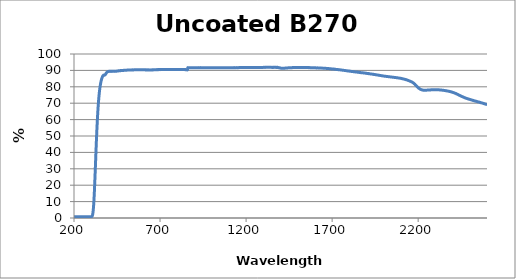
| Category | % Transmission |
|---|---|
| 2600.0 | 69.116 |
| 2599.0 | 69.14 |
| 2598.0 | 69.189 |
| 2597.0 | 69.218 |
| 2596.0 | 69.261 |
| 2595.0 | 69.309 |
| 2594.0 | 69.369 |
| 2593.0 | 69.388 |
| 2592.0 | 69.405 |
| 2591.0 | 69.42 |
| 2590.0 | 69.465 |
| 2589.0 | 69.522 |
| 2588.0 | 69.578 |
| 2587.0 | 69.609 |
| 2586.0 | 69.634 |
| 2585.0 | 69.664 |
| 2584.0 | 69.668 |
| 2583.0 | 69.731 |
| 2582.0 | 69.745 |
| 2581.0 | 69.807 |
| 2580.0 | 69.848 |
| 2579.0 | 69.88 |
| 2578.0 | 69.918 |
| 2577.0 | 69.944 |
| 2576.0 | 69.965 |
| 2575.0 | 69.997 |
| 2574.0 | 70.043 |
| 2573.0 | 70.062 |
| 2572.0 | 70.1 |
| 2571.0 | 70.118 |
| 2570.0 | 70.163 |
| 2569.0 | 70.201 |
| 2568.0 | 70.221 |
| 2567.0 | 70.244 |
| 2566.0 | 70.247 |
| 2565.0 | 70.27 |
| 2564.0 | 70.303 |
| 2563.0 | 70.335 |
| 2562.0 | 70.395 |
| 2561.0 | 70.423 |
| 2560.0 | 70.441 |
| 2559.0 | 70.482 |
| 2558.0 | 70.511 |
| 2557.0 | 70.542 |
| 2556.0 | 70.609 |
| 2555.0 | 70.639 |
| 2554.0 | 70.677 |
| 2553.0 | 70.68 |
| 2552.0 | 70.685 |
| 2551.0 | 70.708 |
| 2550.0 | 70.737 |
| 2549.0 | 70.765 |
| 2548.0 | 70.806 |
| 2547.0 | 70.851 |
| 2546.0 | 70.889 |
| 2545.0 | 70.893 |
| 2544.0 | 70.916 |
| 2543.0 | 70.946 |
| 2542.0 | 70.985 |
| 2541.0 | 71.043 |
| 2540.0 | 71.072 |
| 2539.0 | 71.084 |
| 2538.0 | 71.131 |
| 2537.0 | 71.17 |
| 2536.0 | 71.182 |
| 2535.0 | 71.202 |
| 2534.0 | 71.219 |
| 2533.0 | 71.249 |
| 2532.0 | 71.286 |
| 2531.0 | 71.333 |
| 2530.0 | 71.334 |
| 2529.0 | 71.368 |
| 2528.0 | 71.401 |
| 2527.0 | 71.455 |
| 2526.0 | 71.484 |
| 2525.0 | 71.505 |
| 2524.0 | 71.526 |
| 2523.0 | 71.565 |
| 2522.0 | 71.606 |
| 2521.0 | 71.629 |
| 2520.0 | 71.657 |
| 2519.0 | 71.678 |
| 2518.0 | 71.716 |
| 2517.0 | 71.77 |
| 2516.0 | 71.798 |
| 2515.0 | 71.824 |
| 2514.0 | 71.855 |
| 2513.0 | 71.877 |
| 2512.0 | 71.908 |
| 2511.0 | 71.929 |
| 2510.0 | 71.972 |
| 2509.0 | 72.004 |
| 2508.0 | 72.03 |
| 2507.0 | 72.074 |
| 2506.0 | 72.116 |
| 2505.0 | 72.154 |
| 2504.0 | 72.19 |
| 2503.0 | 72.197 |
| 2502.0 | 72.226 |
| 2501.0 | 72.265 |
| 2500.0 | 72.308 |
| 2499.0 | 72.335 |
| 2498.0 | 72.38 |
| 2497.0 | 72.411 |
| 2496.0 | 72.446 |
| 2495.0 | 72.469 |
| 2494.0 | 72.473 |
| 2493.0 | 72.484 |
| 2492.0 | 72.523 |
| 2491.0 | 72.568 |
| 2490.0 | 72.634 |
| 2489.0 | 72.668 |
| 2488.0 | 72.7 |
| 2487.0 | 72.739 |
| 2486.0 | 72.753 |
| 2485.0 | 72.778 |
| 2484.0 | 72.816 |
| 2483.0 | 72.873 |
| 2482.0 | 72.9 |
| 2481.0 | 72.934 |
| 2480.0 | 72.977 |
| 2479.0 | 73.023 |
| 2478.0 | 73.058 |
| 2477.0 | 73.094 |
| 2476.0 | 73.13 |
| 2475.0 | 73.161 |
| 2474.0 | 73.191 |
| 2473.0 | 73.233 |
| 2472.0 | 73.284 |
| 2471.0 | 73.334 |
| 2470.0 | 73.378 |
| 2469.0 | 73.427 |
| 2468.0 | 73.47 |
| 2467.0 | 73.521 |
| 2466.0 | 73.56 |
| 2465.0 | 73.612 |
| 2464.0 | 73.668 |
| 2463.0 | 73.713 |
| 2462.0 | 73.742 |
| 2461.0 | 73.78 |
| 2460.0 | 73.809 |
| 2459.0 | 73.857 |
| 2458.0 | 73.929 |
| 2457.0 | 73.994 |
| 2456.0 | 74.032 |
| 2455.0 | 74.065 |
| 2454.0 | 74.106 |
| 2453.0 | 74.15 |
| 2452.0 | 74.188 |
| 2451.0 | 74.227 |
| 2450.0 | 74.28 |
| 2449.0 | 74.339 |
| 2448.0 | 74.411 |
| 2447.0 | 74.457 |
| 2446.0 | 74.499 |
| 2445.0 | 74.547 |
| 2444.0 | 74.587 |
| 2443.0 | 74.638 |
| 2442.0 | 74.69 |
| 2441.0 | 74.74 |
| 2440.0 | 74.799 |
| 2439.0 | 74.855 |
| 2438.0 | 74.893 |
| 2437.0 | 74.929 |
| 2436.0 | 74.978 |
| 2435.0 | 75.032 |
| 2434.0 | 75.098 |
| 2433.0 | 75.175 |
| 2432.0 | 75.242 |
| 2431.0 | 75.296 |
| 2430.0 | 75.33 |
| 2429.0 | 75.372 |
| 2428.0 | 75.439 |
| 2427.0 | 75.493 |
| 2426.0 | 75.528 |
| 2425.0 | 75.576 |
| 2424.0 | 75.615 |
| 2423.0 | 75.653 |
| 2422.0 | 75.711 |
| 2421.0 | 75.786 |
| 2420.0 | 75.858 |
| 2419.0 | 75.903 |
| 2418.0 | 75.934 |
| 2417.0 | 75.967 |
| 2416.0 | 76.001 |
| 2415.0 | 76.044 |
| 2414.0 | 76.095 |
| 2413.0 | 76.128 |
| 2412.0 | 76.178 |
| 2411.0 | 76.23 |
| 2410.0 | 76.265 |
| 2409.0 | 76.302 |
| 2408.0 | 76.327 |
| 2407.0 | 76.374 |
| 2406.0 | 76.417 |
| 2405.0 | 76.459 |
| 2404.0 | 76.512 |
| 2403.0 | 76.544 |
| 2402.0 | 76.567 |
| 2401.0 | 76.594 |
| 2400.0 | 76.624 |
| 2399.0 | 76.653 |
| 2398.0 | 76.697 |
| 2397.0 | 76.749 |
| 2396.0 | 76.783 |
| 2395.0 | 76.81 |
| 2394.0 | 76.838 |
| 2393.0 | 76.872 |
| 2392.0 | 76.909 |
| 2391.0 | 76.939 |
| 2390.0 | 76.959 |
| 2389.0 | 76.97 |
| 2388.0 | 77.01 |
| 2387.0 | 77.062 |
| 2386.0 | 77.091 |
| 2385.0 | 77.105 |
| 2384.0 | 77.116 |
| 2383.0 | 77.134 |
| 2382.0 | 77.155 |
| 2381.0 | 77.186 |
| 2380.0 | 77.245 |
| 2379.0 | 77.28 |
| 2378.0 | 77.286 |
| 2377.0 | 77.291 |
| 2376.0 | 77.315 |
| 2375.0 | 77.342 |
| 2374.0 | 77.364 |
| 2373.0 | 77.37 |
| 2372.0 | 77.402 |
| 2371.0 | 77.437 |
| 2370.0 | 77.464 |
| 2369.0 | 77.493 |
| 2368.0 | 77.502 |
| 2367.0 | 77.499 |
| 2366.0 | 77.508 |
| 2365.0 | 77.536 |
| 2364.0 | 77.55 |
| 2363.0 | 77.583 |
| 2362.0 | 77.605 |
| 2361.0 | 77.632 |
| 2360.0 | 77.656 |
| 2359.0 | 77.66 |
| 2358.0 | 77.672 |
| 2357.0 | 77.686 |
| 2356.0 | 77.7 |
| 2355.0 | 77.727 |
| 2354.0 | 77.747 |
| 2353.0 | 77.765 |
| 2352.0 | 77.776 |
| 2351.0 | 77.789 |
| 2350.0 | 77.802 |
| 2349.0 | 77.83 |
| 2348.0 | 77.836 |
| 2347.0 | 77.866 |
| 2346.0 | 77.904 |
| 2345.0 | 77.89 |
| 2344.0 | 77.894 |
| 2343.0 | 77.918 |
| 2342.0 | 77.923 |
| 2341.0 | 77.918 |
| 2340.0 | 77.918 |
| 2339.0 | 77.952 |
| 2338.0 | 77.975 |
| 2337.0 | 77.997 |
| 2336.0 | 78.012 |
| 2335.0 | 78.021 |
| 2334.0 | 78.003 |
| 2333.0 | 77.996 |
| 2332.0 | 78.009 |
| 2331.0 | 78.046 |
| 2330.0 | 78.067 |
| 2329.0 | 78.088 |
| 2328.0 | 78.09 |
| 2327.0 | 78.086 |
| 2326.0 | 78.101 |
| 2325.0 | 78.101 |
| 2324.0 | 78.105 |
| 2323.0 | 78.137 |
| 2322.0 | 78.146 |
| 2321.0 | 78.142 |
| 2320.0 | 78.137 |
| 2319.0 | 78.159 |
| 2318.0 | 78.162 |
| 2317.0 | 78.161 |
| 2316.0 | 78.149 |
| 2315.0 | 78.155 |
| 2314.0 | 78.177 |
| 2313.0 | 78.183 |
| 2312.0 | 78.177 |
| 2311.0 | 78.176 |
| 2310.0 | 78.196 |
| 2309.0 | 78.202 |
| 2308.0 | 78.208 |
| 2307.0 | 78.21 |
| 2306.0 | 78.218 |
| 2305.0 | 78.232 |
| 2304.0 | 78.245 |
| 2303.0 | 78.227 |
| 2302.0 | 78.213 |
| 2301.0 | 78.204 |
| 2300.0 | 78.212 |
| 2299.0 | 78.199 |
| 2298.0 | 78.232 |
| 2297.0 | 78.244 |
| 2296.0 | 78.231 |
| 2295.0 | 78.217 |
| 2294.0 | 78.215 |
| 2293.0 | 78.204 |
| 2292.0 | 78.215 |
| 2291.0 | 78.211 |
| 2290.0 | 78.19 |
| 2289.0 | 78.212 |
| 2288.0 | 78.212 |
| 2287.0 | 78.207 |
| 2286.0 | 78.208 |
| 2285.0 | 78.185 |
| 2284.0 | 78.181 |
| 2283.0 | 78.16 |
| 2282.0 | 78.151 |
| 2281.0 | 78.167 |
| 2280.0 | 78.173 |
| 2279.0 | 78.193 |
| 2278.0 | 78.178 |
| 2277.0 | 78.162 |
| 2276.0 | 78.167 |
| 2275.0 | 78.141 |
| 2274.0 | 78.142 |
| 2273.0 | 78.107 |
| 2272.0 | 78.097 |
| 2271.0 | 78.105 |
| 2270.0 | 78.106 |
| 2269.0 | 78.095 |
| 2268.0 | 78.098 |
| 2267.0 | 78.099 |
| 2266.0 | 78.104 |
| 2265.0 | 78.106 |
| 2264.0 | 78.078 |
| 2263.0 | 78.061 |
| 2262.0 | 78.048 |
| 2261.0 | 78.049 |
| 2260.0 | 78.011 |
| 2259.0 | 78.012 |
| 2258.0 | 78.003 |
| 2257.0 | 77.992 |
| 2256.0 | 78.001 |
| 2255.0 | 78.012 |
| 2254.0 | 78.011 |
| 2253.0 | 77.994 |
| 2252.0 | 77.976 |
| 2251.0 | 77.968 |
| 2250.0 | 77.962 |
| 2249.0 | 77.961 |
| 2248.0 | 77.947 |
| 2247.0 | 77.94 |
| 2246.0 | 77.906 |
| 2245.0 | 77.922 |
| 2244.0 | 77.925 |
| 2243.0 | 77.943 |
| 2242.0 | 77.917 |
| 2241.0 | 77.925 |
| 2240.0 | 77.903 |
| 2239.0 | 77.89 |
| 2238.0 | 77.908 |
| 2237.0 | 77.898 |
| 2236.0 | 77.923 |
| 2235.0 | 77.922 |
| 2234.0 | 77.909 |
| 2233.0 | 77.899 |
| 2232.0 | 77.922 |
| 2231.0 | 77.915 |
| 2230.0 | 77.924 |
| 2229.0 | 77.952 |
| 2228.0 | 77.975 |
| 2227.0 | 78.02 |
| 2226.0 | 78.027 |
| 2225.0 | 78.048 |
| 2224.0 | 78.073 |
| 2223.0 | 78.098 |
| 2222.0 | 78.118 |
| 2221.0 | 78.158 |
| 2220.0 | 78.208 |
| 2219.0 | 78.22 |
| 2218.0 | 78.25 |
| 2217.0 | 78.309 |
| 2216.0 | 78.352 |
| 2215.0 | 78.404 |
| 2214.0 | 78.436 |
| 2213.0 | 78.489 |
| 2212.0 | 78.561 |
| 2211.0 | 78.646 |
| 2210.0 | 78.7 |
| 2209.0 | 78.764 |
| 2208.0 | 78.832 |
| 2207.0 | 78.907 |
| 2206.0 | 78.969 |
| 2205.0 | 79.05 |
| 2204.0 | 79.131 |
| 2203.0 | 79.197 |
| 2202.0 | 79.283 |
| 2201.0 | 79.341 |
| 2200.0 | 79.433 |
| 2199.0 | 79.549 |
| 2198.0 | 79.707 |
| 2197.0 | 79.754 |
| 2196.0 | 79.857 |
| 2195.0 | 79.95 |
| 2194.0 | 80.057 |
| 2193.0 | 80.179 |
| 2192.0 | 80.303 |
| 2191.0 | 80.417 |
| 2190.0 | 80.52 |
| 2189.0 | 80.635 |
| 2188.0 | 80.73 |
| 2187.0 | 80.857 |
| 2186.0 | 80.992 |
| 2185.0 | 81.098 |
| 2184.0 | 81.221 |
| 2183.0 | 81.294 |
| 2182.0 | 81.434 |
| 2181.0 | 81.545 |
| 2180.0 | 81.646 |
| 2179.0 | 81.726 |
| 2178.0 | 81.839 |
| 2177.0 | 81.936 |
| 2176.0 | 82.029 |
| 2175.0 | 82.106 |
| 2174.0 | 82.194 |
| 2173.0 | 82.277 |
| 2172.0 | 82.359 |
| 2171.0 | 82.426 |
| 2170.0 | 82.51 |
| 2169.0 | 82.563 |
| 2168.0 | 82.636 |
| 2167.0 | 82.71 |
| 2166.0 | 82.774 |
| 2165.0 | 82.826 |
| 2164.0 | 82.894 |
| 2163.0 | 82.962 |
| 2162.0 | 82.995 |
| 2161.0 | 83.045 |
| 2160.0 | 83.117 |
| 2159.0 | 83.165 |
| 2158.0 | 83.188 |
| 2157.0 | 83.228 |
| 2156.0 | 83.28 |
| 2155.0 | 83.315 |
| 2154.0 | 83.387 |
| 2153.0 | 83.441 |
| 2152.0 | 83.497 |
| 2151.0 | 83.539 |
| 2150.0 | 83.567 |
| 2149.0 | 83.618 |
| 2148.0 | 83.645 |
| 2147.0 | 83.671 |
| 2146.0 | 83.735 |
| 2145.0 | 83.775 |
| 2144.0 | 83.808 |
| 2143.0 | 83.822 |
| 2142.0 | 83.859 |
| 2141.0 | 83.907 |
| 2140.0 | 83.956 |
| 2139.0 | 84.006 |
| 2138.0 | 84.035 |
| 2137.0 | 84.096 |
| 2136.0 | 84.136 |
| 2135.0 | 84.169 |
| 2134.0 | 84.184 |
| 2133.0 | 84.216 |
| 2132.0 | 84.262 |
| 2131.0 | 84.283 |
| 2130.0 | 84.314 |
| 2129.0 | 84.358 |
| 2128.0 | 84.4 |
| 2127.0 | 84.443 |
| 2126.0 | 84.458 |
| 2125.0 | 84.475 |
| 2124.0 | 84.488 |
| 2123.0 | 84.534 |
| 2122.0 | 84.574 |
| 2121.0 | 84.604 |
| 2120.0 | 84.621 |
| 2119.0 | 84.664 |
| 2118.0 | 84.671 |
| 2117.0 | 84.703 |
| 2116.0 | 84.723 |
| 2115.0 | 84.739 |
| 2114.0 | 84.789 |
| 2113.0 | 84.804 |
| 2112.0 | 84.83 |
| 2111.0 | 84.854 |
| 2110.0 | 84.89 |
| 2109.0 | 84.929 |
| 2108.0 | 84.936 |
| 2107.0 | 84.948 |
| 2106.0 | 84.956 |
| 2105.0 | 84.987 |
| 2104.0 | 85.037 |
| 2103.0 | 85.047 |
| 2102.0 | 85.078 |
| 2101.0 | 85.103 |
| 2100.0 | 85.136 |
| 2099.0 | 85.168 |
| 2098.0 | 85.173 |
| 2097.0 | 85.191 |
| 2096.0 | 85.217 |
| 2095.0 | 85.235 |
| 2094.0 | 85.264 |
| 2093.0 | 85.271 |
| 2092.0 | 85.287 |
| 2091.0 | 85.295 |
| 2090.0 | 85.311 |
| 2089.0 | 85.327 |
| 2088.0 | 85.347 |
| 2087.0 | 85.365 |
| 2086.0 | 85.36 |
| 2085.0 | 85.362 |
| 2084.0 | 85.4 |
| 2083.0 | 85.427 |
| 2082.0 | 85.443 |
| 2081.0 | 85.453 |
| 2080.0 | 85.474 |
| 2079.0 | 85.507 |
| 2078.0 | 85.523 |
| 2077.0 | 85.522 |
| 2076.0 | 85.52 |
| 2075.0 | 85.531 |
| 2074.0 | 85.549 |
| 2073.0 | 85.574 |
| 2072.0 | 85.591 |
| 2071.0 | 85.62 |
| 2070.0 | 85.656 |
| 2069.0 | 85.67 |
| 2068.0 | 85.65 |
| 2067.0 | 85.649 |
| 2066.0 | 85.652 |
| 2065.0 | 85.67 |
| 2064.0 | 85.692 |
| 2063.0 | 85.711 |
| 2062.0 | 85.731 |
| 2061.0 | 85.739 |
| 2060.0 | 85.755 |
| 2059.0 | 85.787 |
| 2058.0 | 85.801 |
| 2057.0 | 85.803 |
| 2056.0 | 85.808 |
| 2055.0 | 85.819 |
| 2054.0 | 85.813 |
| 2053.0 | 85.815 |
| 2052.0 | 85.817 |
| 2051.0 | 85.835 |
| 2050.0 | 85.868 |
| 2049.0 | 85.888 |
| 2048.0 | 85.903 |
| 2047.0 | 85.913 |
| 2046.0 | 85.92 |
| 2045.0 | 85.94 |
| 2044.0 | 85.962 |
| 2043.0 | 85.962 |
| 2042.0 | 85.976 |
| 2041.0 | 86.001 |
| 2040.0 | 86.01 |
| 2039.0 | 86.023 |
| 2038.0 | 86.03 |
| 2037.0 | 86.044 |
| 2036.0 | 86.059 |
| 2035.0 | 86.07 |
| 2034.0 | 86.082 |
| 2033.0 | 86.101 |
| 2032.0 | 86.135 |
| 2031.0 | 86.164 |
| 2030.0 | 86.174 |
| 2029.0 | 86.162 |
| 2028.0 | 86.178 |
| 2027.0 | 86.192 |
| 2026.0 | 86.188 |
| 2025.0 | 86.216 |
| 2024.0 | 86.233 |
| 2023.0 | 86.238 |
| 2022.0 | 86.259 |
| 2021.0 | 86.253 |
| 2020.0 | 86.255 |
| 2019.0 | 86.28 |
| 2018.0 | 86.293 |
| 2017.0 | 86.315 |
| 2016.0 | 86.334 |
| 2015.0 | 86.348 |
| 2014.0 | 86.354 |
| 2013.0 | 86.353 |
| 2012.0 | 86.375 |
| 2011.0 | 86.405 |
| 2010.0 | 86.419 |
| 2009.0 | 86.434 |
| 2008.0 | 86.447 |
| 2007.0 | 86.46 |
| 2006.0 | 86.47 |
| 2005.0 | 86.478 |
| 2004.0 | 86.475 |
| 2003.0 | 86.499 |
| 2002.0 | 86.517 |
| 2001.0 | 86.531 |
| 2000.0 | 86.557 |
| 1999.0 | 86.579 |
| 1998.0 | 86.592 |
| 1997.0 | 86.6 |
| 1996.0 | 86.616 |
| 1995.0 | 86.631 |
| 1994.0 | 86.656 |
| 1993.0 | 86.66 |
| 1992.0 | 86.675 |
| 1991.0 | 86.712 |
| 1990.0 | 86.727 |
| 1989.0 | 86.721 |
| 1988.0 | 86.75 |
| 1987.0 | 86.773 |
| 1986.0 | 86.795 |
| 1985.0 | 86.81 |
| 1984.0 | 86.827 |
| 1983.0 | 86.831 |
| 1982.0 | 86.846 |
| 1981.0 | 86.865 |
| 1980.0 | 86.881 |
| 1979.0 | 86.906 |
| 1978.0 | 86.928 |
| 1977.0 | 86.946 |
| 1976.0 | 86.958 |
| 1975.0 | 86.976 |
| 1974.0 | 86.994 |
| 1973.0 | 87.022 |
| 1972.0 | 87.032 |
| 1971.0 | 87.054 |
| 1970.0 | 87.074 |
| 1969.0 | 87.091 |
| 1968.0 | 87.127 |
| 1967.0 | 87.143 |
| 1966.0 | 87.142 |
| 1965.0 | 87.162 |
| 1964.0 | 87.19 |
| 1963.0 | 87.201 |
| 1962.0 | 87.233 |
| 1961.0 | 87.253 |
| 1960.0 | 87.238 |
| 1959.0 | 87.264 |
| 1958.0 | 87.283 |
| 1957.0 | 87.284 |
| 1956.0 | 87.328 |
| 1955.0 | 87.343 |
| 1954.0 | 87.379 |
| 1953.0 | 87.402 |
| 1952.0 | 87.39 |
| 1951.0 | 87.398 |
| 1950.0 | 87.439 |
| 1949.0 | 87.449 |
| 1948.0 | 87.443 |
| 1947.0 | 87.474 |
| 1946.0 | 87.487 |
| 1945.0 | 87.487 |
| 1944.0 | 87.546 |
| 1943.0 | 87.545 |
| 1942.0 | 87.511 |
| 1941.0 | 87.6 |
| 1940.0 | 87.611 |
| 1939.0 | 87.654 |
| 1938.0 | 87.654 |
| 1937.0 | 87.665 |
| 1936.0 | 87.681 |
| 1935.0 | 87.677 |
| 1934.0 | 87.679 |
| 1933.0 | 87.704 |
| 1932.0 | 87.752 |
| 1931.0 | 87.764 |
| 1930.0 | 87.766 |
| 1929.0 | 87.76 |
| 1928.0 | 87.76 |
| 1927.0 | 87.788 |
| 1926.0 | 87.795 |
| 1925.0 | 87.812 |
| 1924.0 | 87.825 |
| 1923.0 | 87.858 |
| 1922.0 | 87.871 |
| 1921.0 | 87.874 |
| 1920.0 | 87.878 |
| 1919.0 | 87.904 |
| 1918.0 | 87.899 |
| 1917.0 | 87.953 |
| 1916.0 | 87.99 |
| 1915.0 | 88.037 |
| 1914.0 | 88.038 |
| 1913.0 | 88.028 |
| 1912.0 | 88.014 |
| 1911.0 | 88.048 |
| 1910.0 | 88.043 |
| 1909.0 | 88.078 |
| 1908.0 | 88.14 |
| 1907.0 | 88.151 |
| 1906.0 | 88.181 |
| 1905.0 | 88.174 |
| 1904.0 | 88.152 |
| 1903.0 | 88.145 |
| 1902.0 | 88.162 |
| 1901.0 | 88.215 |
| 1900.0 | 88.179 |
| 1899.0 | 88.226 |
| 1898.0 | 88.282 |
| 1897.0 | 88.248 |
| 1896.0 | 88.295 |
| 1895.0 | 88.246 |
| 1894.0 | 88.327 |
| 1893.0 | 88.353 |
| 1892.0 | 88.374 |
| 1891.0 | 88.333 |
| 1890.0 | 88.354 |
| 1889.0 | 88.357 |
| 1888.0 | 88.373 |
| 1887.0 | 88.437 |
| 1886.0 | 88.421 |
| 1885.0 | 88.426 |
| 1884.0 | 88.453 |
| 1883.0 | 88.445 |
| 1882.0 | 88.494 |
| 1881.0 | 88.466 |
| 1880.0 | 88.529 |
| 1879.0 | 88.491 |
| 1878.0 | 88.533 |
| 1877.0 | 88.544 |
| 1876.0 | 88.582 |
| 1875.0 | 88.592 |
| 1874.0 | 88.606 |
| 1873.0 | 88.596 |
| 1872.0 | 88.579 |
| 1871.0 | 88.592 |
| 1870.0 | 88.602 |
| 1869.0 | 88.589 |
| 1868.0 | 88.603 |
| 1867.0 | 88.631 |
| 1866.0 | 88.643 |
| 1865.0 | 88.645 |
| 1864.0 | 88.701 |
| 1863.0 | 88.745 |
| 1862.0 | 88.756 |
| 1861.0 | 88.759 |
| 1860.0 | 88.742 |
| 1859.0 | 88.738 |
| 1858.0 | 88.796 |
| 1857.0 | 88.796 |
| 1856.0 | 88.787 |
| 1855.0 | 88.807 |
| 1854.0 | 88.833 |
| 1853.0 | 88.853 |
| 1852.0 | 88.845 |
| 1851.0 | 88.825 |
| 1850.0 | 88.894 |
| 1849.0 | 88.933 |
| 1848.0 | 89.016 |
| 1847.0 | 88.977 |
| 1846.0 | 88.914 |
| 1845.0 | 88.995 |
| 1844.0 | 88.957 |
| 1843.0 | 88.944 |
| 1842.0 | 88.978 |
| 1841.0 | 89.013 |
| 1840.0 | 88.976 |
| 1839.0 | 89.03 |
| 1838.0 | 88.986 |
| 1837.0 | 89.049 |
| 1836.0 | 89.05 |
| 1835.0 | 89.077 |
| 1834.0 | 89.031 |
| 1833.0 | 89.073 |
| 1832.0 | 89.121 |
| 1831.0 | 89.125 |
| 1830.0 | 89.13 |
| 1829.0 | 89.2 |
| 1828.0 | 89.179 |
| 1827.0 | 89.171 |
| 1826.0 | 89.198 |
| 1825.0 | 89.199 |
| 1824.0 | 89.217 |
| 1823.0 | 89.257 |
| 1822.0 | 89.266 |
| 1821.0 | 89.286 |
| 1820.0 | 89.272 |
| 1819.0 | 89.288 |
| 1818.0 | 89.283 |
| 1817.0 | 89.3 |
| 1816.0 | 89.347 |
| 1815.0 | 89.357 |
| 1814.0 | 89.378 |
| 1813.0 | 89.388 |
| 1812.0 | 89.387 |
| 1811.0 | 89.387 |
| 1810.0 | 89.404 |
| 1809.0 | 89.417 |
| 1808.0 | 89.467 |
| 1807.0 | 89.472 |
| 1806.0 | 89.486 |
| 1805.0 | 89.502 |
| 1804.0 | 89.523 |
| 1803.0 | 89.524 |
| 1802.0 | 89.541 |
| 1801.0 | 89.55 |
| 1800.0 | 89.58 |
| 1799.0 | 89.594 |
| 1798.0 | 89.599 |
| 1797.0 | 89.609 |
| 1796.0 | 89.646 |
| 1795.0 | 89.619 |
| 1794.0 | 89.635 |
| 1793.0 | 89.653 |
| 1792.0 | 89.668 |
| 1791.0 | 89.685 |
| 1790.0 | 89.694 |
| 1789.0 | 89.708 |
| 1788.0 | 89.726 |
| 1787.0 | 89.754 |
| 1786.0 | 89.774 |
| 1785.0 | 89.792 |
| 1784.0 | 89.785 |
| 1783.0 | 89.811 |
| 1782.0 | 89.82 |
| 1781.0 | 89.822 |
| 1780.0 | 89.858 |
| 1779.0 | 89.862 |
| 1778.0 | 89.873 |
| 1777.0 | 89.894 |
| 1776.0 | 89.893 |
| 1775.0 | 89.916 |
| 1774.0 | 89.92 |
| 1773.0 | 89.951 |
| 1772.0 | 89.959 |
| 1771.0 | 89.97 |
| 1770.0 | 89.997 |
| 1769.0 | 90.011 |
| 1768.0 | 90.027 |
| 1767.0 | 90.041 |
| 1766.0 | 90.068 |
| 1765.0 | 90.081 |
| 1764.0 | 90.087 |
| 1763.0 | 90.1 |
| 1762.0 | 90.11 |
| 1761.0 | 90.133 |
| 1760.0 | 90.129 |
| 1759.0 | 90.148 |
| 1758.0 | 90.169 |
| 1757.0 | 90.185 |
| 1756.0 | 90.191 |
| 1755.0 | 90.218 |
| 1754.0 | 90.241 |
| 1753.0 | 90.233 |
| 1752.0 | 90.245 |
| 1751.0 | 90.269 |
| 1750.0 | 90.307 |
| 1749.0 | 90.304 |
| 1748.0 | 90.312 |
| 1747.0 | 90.334 |
| 1746.0 | 90.35 |
| 1745.0 | 90.366 |
| 1744.0 | 90.371 |
| 1743.0 | 90.39 |
| 1742.0 | 90.388 |
| 1741.0 | 90.395 |
| 1740.0 | 90.404 |
| 1739.0 | 90.408 |
| 1738.0 | 90.418 |
| 1737.0 | 90.426 |
| 1736.0 | 90.44 |
| 1735.0 | 90.444 |
| 1734.0 | 90.511 |
| 1733.0 | 90.509 |
| 1732.0 | 90.523 |
| 1731.0 | 90.519 |
| 1730.0 | 90.537 |
| 1729.0 | 90.546 |
| 1728.0 | 90.557 |
| 1727.0 | 90.575 |
| 1726.0 | 90.595 |
| 1725.0 | 90.596 |
| 1724.0 | 90.607 |
| 1723.0 | 90.618 |
| 1722.0 | 90.619 |
| 1721.0 | 90.641 |
| 1720.0 | 90.659 |
| 1719.0 | 90.685 |
| 1718.0 | 90.688 |
| 1717.0 | 90.692 |
| 1716.0 | 90.713 |
| 1715.0 | 90.722 |
| 1714.0 | 90.746 |
| 1713.0 | 90.777 |
| 1712.0 | 90.777 |
| 1711.0 | 90.765 |
| 1710.0 | 90.789 |
| 1709.0 | 90.82 |
| 1708.0 | 90.818 |
| 1707.0 | 90.831 |
| 1706.0 | 90.842 |
| 1705.0 | 90.865 |
| 1704.0 | 90.875 |
| 1703.0 | 90.877 |
| 1702.0 | 90.883 |
| 1701.0 | 90.884 |
| 1700.0 | 90.883 |
| 1699.0 | 90.875 |
| 1698.0 | 90.88 |
| 1697.0 | 90.906 |
| 1696.0 | 90.93 |
| 1695.0 | 90.928 |
| 1694.0 | 90.923 |
| 1693.0 | 90.952 |
| 1692.0 | 90.982 |
| 1691.0 | 90.985 |
| 1690.0 | 91 |
| 1689.0 | 91.015 |
| 1688.0 | 91.024 |
| 1687.0 | 91.034 |
| 1686.0 | 91.05 |
| 1685.0 | 91.056 |
| 1684.0 | 91.058 |
| 1683.0 | 91.064 |
| 1682.0 | 91.083 |
| 1681.0 | 91.103 |
| 1680.0 | 91.097 |
| 1679.0 | 91.093 |
| 1678.0 | 91.122 |
| 1677.0 | 91.129 |
| 1676.0 | 91.13 |
| 1675.0 | 91.152 |
| 1674.0 | 91.155 |
| 1673.0 | 91.143 |
| 1672.0 | 91.185 |
| 1671.0 | 91.209 |
| 1670.0 | 91.209 |
| 1669.0 | 91.218 |
| 1668.0 | 91.219 |
| 1667.0 | 91.207 |
| 1666.0 | 91.204 |
| 1665.0 | 91.226 |
| 1664.0 | 91.244 |
| 1663.0 | 91.244 |
| 1662.0 | 91.252 |
| 1661.0 | 91.263 |
| 1660.0 | 91.271 |
| 1659.0 | 91.276 |
| 1658.0 | 91.262 |
| 1657.0 | 91.273 |
| 1656.0 | 91.283 |
| 1655.0 | 91.291 |
| 1654.0 | 91.302 |
| 1653.0 | 91.304 |
| 1652.0 | 91.312 |
| 1651.0 | 91.325 |
| 1650.0 | 91.343 |
| 1649.0 | 91.36 |
| 1648.0 | 91.361 |
| 1647.0 | 91.348 |
| 1646.0 | 91.355 |
| 1645.0 | 91.369 |
| 1644.0 | 91.386 |
| 1643.0 | 91.396 |
| 1642.0 | 91.391 |
| 1641.0 | 91.382 |
| 1640.0 | 91.386 |
| 1639.0 | 91.396 |
| 1638.0 | 91.398 |
| 1637.0 | 91.422 |
| 1636.0 | 91.448 |
| 1635.0 | 91.461 |
| 1634.0 | 91.451 |
| 1633.0 | 91.43 |
| 1632.0 | 91.422 |
| 1631.0 | 91.426 |
| 1630.0 | 91.433 |
| 1629.0 | 91.466 |
| 1628.0 | 91.483 |
| 1627.0 | 91.472 |
| 1626.0 | 91.474 |
| 1625.0 | 91.475 |
| 1624.0 | 91.48 |
| 1623.0 | 91.487 |
| 1622.0 | 91.5 |
| 1621.0 | 91.497 |
| 1620.0 | 91.497 |
| 1619.0 | 91.512 |
| 1618.0 | 91.523 |
| 1617.0 | 91.531 |
| 1616.0 | 91.528 |
| 1615.0 | 91.541 |
| 1614.0 | 91.558 |
| 1613.0 | 91.553 |
| 1612.0 | 91.549 |
| 1611.0 | 91.531 |
| 1610.0 | 91.521 |
| 1609.0 | 91.513 |
| 1608.0 | 91.526 |
| 1607.0 | 91.53 |
| 1606.0 | 91.531 |
| 1605.0 | 91.555 |
| 1604.0 | 91.56 |
| 1603.0 | 91.572 |
| 1602.0 | 91.579 |
| 1601.0 | 91.588 |
| 1600.0 | 91.599 |
| 1599.0 | 91.603 |
| 1598.0 | 91.603 |
| 1597.0 | 91.6 |
| 1596.0 | 91.594 |
| 1595.0 | 91.59 |
| 1594.0 | 91.591 |
| 1593.0 | 91.589 |
| 1592.0 | 91.605 |
| 1591.0 | 91.611 |
| 1590.0 | 91.632 |
| 1589.0 | 91.636 |
| 1588.0 | 91.635 |
| 1587.0 | 91.649 |
| 1586.0 | 91.645 |
| 1585.0 | 91.629 |
| 1584.0 | 91.63 |
| 1583.0 | 91.622 |
| 1582.0 | 91.633 |
| 1581.0 | 91.643 |
| 1580.0 | 91.632 |
| 1579.0 | 91.65 |
| 1578.0 | 91.651 |
| 1577.0 | 91.656 |
| 1576.0 | 91.68 |
| 1575.0 | 91.696 |
| 1574.0 | 91.685 |
| 1573.0 | 91.655 |
| 1572.0 | 91.658 |
| 1571.0 | 91.666 |
| 1570.0 | 91.692 |
| 1569.0 | 91.695 |
| 1568.0 | 91.694 |
| 1567.0 | 91.701 |
| 1566.0 | 91.719 |
| 1565.0 | 91.69 |
| 1564.0 | 91.685 |
| 1563.0 | 91.705 |
| 1562.0 | 91.701 |
| 1561.0 | 91.726 |
| 1560.0 | 91.729 |
| 1559.0 | 91.701 |
| 1558.0 | 91.728 |
| 1557.0 | 91.745 |
| 1556.0 | 91.729 |
| 1555.0 | 91.722 |
| 1554.0 | 91.734 |
| 1553.0 | 91.711 |
| 1552.0 | 91.725 |
| 1551.0 | 91.74 |
| 1550.0 | 91.753 |
| 1549.0 | 91.75 |
| 1548.0 | 91.747 |
| 1547.0 | 91.75 |
| 1546.0 | 91.751 |
| 1545.0 | 91.742 |
| 1544.0 | 91.751 |
| 1543.0 | 91.732 |
| 1542.0 | 91.732 |
| 1541.0 | 91.738 |
| 1540.0 | 91.759 |
| 1539.0 | 91.765 |
| 1538.0 | 91.77 |
| 1537.0 | 91.746 |
| 1536.0 | 91.752 |
| 1535.0 | 91.76 |
| 1534.0 | 91.763 |
| 1533.0 | 91.74 |
| 1532.0 | 91.752 |
| 1531.0 | 91.766 |
| 1530.0 | 91.768 |
| 1529.0 | 91.791 |
| 1528.0 | 91.761 |
| 1527.0 | 91.785 |
| 1526.0 | 91.783 |
| 1525.0 | 91.782 |
| 1524.0 | 91.763 |
| 1523.0 | 91.772 |
| 1522.0 | 91.763 |
| 1521.0 | 91.776 |
| 1520.0 | 91.801 |
| 1519.0 | 91.764 |
| 1518.0 | 91.779 |
| 1517.0 | 91.778 |
| 1516.0 | 91.768 |
| 1515.0 | 91.765 |
| 1514.0 | 91.762 |
| 1513.0 | 91.761 |
| 1512.0 | 91.758 |
| 1511.0 | 91.748 |
| 1510.0 | 91.756 |
| 1509.0 | 91.762 |
| 1508.0 | 91.751 |
| 1507.0 | 91.753 |
| 1506.0 | 91.749 |
| 1505.0 | 91.759 |
| 1504.0 | 91.763 |
| 1503.0 | 91.776 |
| 1502.0 | 91.732 |
| 1501.0 | 91.738 |
| 1500.0 | 91.763 |
| 1499.0 | 91.761 |
| 1498.0 | 91.762 |
| 1497.0 | 91.768 |
| 1496.0 | 91.766 |
| 1495.0 | 91.743 |
| 1494.0 | 91.711 |
| 1493.0 | 91.738 |
| 1492.0 | 91.734 |
| 1491.0 | 91.747 |
| 1490.0 | 91.742 |
| 1489.0 | 91.763 |
| 1488.0 | 91.755 |
| 1487.0 | 91.74 |
| 1486.0 | 91.727 |
| 1485.0 | 91.713 |
| 1484.0 | 91.712 |
| 1483.0 | 91.719 |
| 1482.0 | 91.721 |
| 1481.0 | 91.714 |
| 1480.0 | 91.724 |
| 1479.0 | 91.727 |
| 1478.0 | 91.701 |
| 1477.0 | 91.735 |
| 1476.0 | 91.7 |
| 1475.0 | 91.711 |
| 1474.0 | 91.7 |
| 1473.0 | 91.702 |
| 1472.0 | 91.702 |
| 1471.0 | 91.714 |
| 1470.0 | 91.689 |
| 1469.0 | 91.702 |
| 1468.0 | 91.689 |
| 1467.0 | 91.681 |
| 1466.0 | 91.68 |
| 1465.0 | 91.688 |
| 1464.0 | 91.663 |
| 1463.0 | 91.661 |
| 1462.0 | 91.674 |
| 1461.0 | 91.672 |
| 1460.0 | 91.638 |
| 1459.0 | 91.633 |
| 1458.0 | 91.623 |
| 1457.0 | 91.652 |
| 1456.0 | 91.625 |
| 1455.0 | 91.612 |
| 1454.0 | 91.616 |
| 1453.0 | 91.634 |
| 1452.0 | 91.583 |
| 1451.0 | 91.601 |
| 1450.0 | 91.588 |
| 1449.0 | 91.572 |
| 1448.0 | 91.583 |
| 1447.0 | 91.572 |
| 1446.0 | 91.582 |
| 1445.0 | 91.573 |
| 1444.0 | 91.555 |
| 1443.0 | 91.528 |
| 1442.0 | 91.512 |
| 1441.0 | 91.539 |
| 1440.0 | 91.511 |
| 1439.0 | 91.498 |
| 1438.0 | 91.478 |
| 1437.0 | 91.464 |
| 1436.0 | 91.48 |
| 1435.0 | 91.469 |
| 1434.0 | 91.456 |
| 1433.0 | 91.465 |
| 1432.0 | 91.445 |
| 1431.0 | 91.429 |
| 1430.0 | 91.406 |
| 1429.0 | 91.398 |
| 1428.0 | 91.409 |
| 1427.0 | 91.399 |
| 1426.0 | 91.388 |
| 1425.0 | 91.359 |
| 1424.0 | 91.347 |
| 1423.0 | 91.336 |
| 1422.0 | 91.316 |
| 1421.0 | 91.304 |
| 1420.0 | 91.294 |
| 1419.0 | 91.288 |
| 1418.0 | 91.293 |
| 1417.0 | 91.322 |
| 1416.0 | 91.294 |
| 1415.0 | 91.325 |
| 1414.0 | 91.306 |
| 1413.0 | 91.304 |
| 1412.0 | 91.278 |
| 1411.0 | 91.272 |
| 1410.0 | 91.284 |
| 1409.0 | 91.301 |
| 1408.0 | 91.344 |
| 1407.0 | 91.321 |
| 1406.0 | 91.32 |
| 1405.0 | 91.305 |
| 1404.0 | 91.311 |
| 1403.0 | 91.342 |
| 1402.0 | 91.342 |
| 1401.0 | 91.395 |
| 1400.0 | 91.423 |
| 1399.0 | 91.409 |
| 1398.0 | 91.424 |
| 1397.0 | 91.482 |
| 1396.0 | 91.564 |
| 1395.0 | 91.606 |
| 1394.0 | 91.644 |
| 1393.0 | 91.622 |
| 1392.0 | 91.615 |
| 1391.0 | 91.637 |
| 1390.0 | 91.682 |
| 1389.0 | 91.676 |
| 1388.0 | 91.675 |
| 1387.0 | 91.778 |
| 1386.0 | 91.753 |
| 1385.0 | 91.759 |
| 1384.0 | 91.849 |
| 1383.0 | 91.818 |
| 1382.0 | 91.856 |
| 1381.0 | 91.886 |
| 1380.0 | 91.792 |
| 1379.0 | 91.744 |
| 1378.0 | 91.779 |
| 1377.0 | 91.833 |
| 1376.0 | 91.808 |
| 1375.0 | 91.858 |
| 1374.0 | 91.851 |
| 1373.0 | 91.88 |
| 1372.0 | 91.9 |
| 1371.0 | 91.909 |
| 1370.0 | 91.837 |
| 1369.0 | 91.8 |
| 1368.0 | 91.845 |
| 1367.0 | 91.886 |
| 1366.0 | 91.871 |
| 1365.0 | 91.848 |
| 1364.0 | 91.88 |
| 1363.0 | 91.909 |
| 1362.0 | 91.894 |
| 1361.0 | 91.881 |
| 1360.0 | 91.863 |
| 1359.0 | 91.881 |
| 1358.0 | 91.812 |
| 1357.0 | 91.766 |
| 1356.0 | 91.868 |
| 1355.0 | 91.873 |
| 1354.0 | 91.846 |
| 1353.0 | 91.836 |
| 1352.0 | 91.821 |
| 1351.0 | 91.834 |
| 1350.0 | 91.816 |
| 1349.0 | 91.84 |
| 1348.0 | 91.851 |
| 1347.0 | 91.843 |
| 1346.0 | 91.87 |
| 1345.0 | 91.88 |
| 1344.0 | 91.864 |
| 1343.0 | 91.861 |
| 1342.0 | 91.863 |
| 1341.0 | 91.86 |
| 1340.0 | 91.864 |
| 1339.0 | 91.881 |
| 1338.0 | 91.866 |
| 1337.0 | 91.846 |
| 1336.0 | 91.862 |
| 1335.0 | 91.87 |
| 1334.0 | 91.869 |
| 1333.0 | 91.866 |
| 1332.0 | 91.863 |
| 1331.0 | 91.859 |
| 1330.0 | 91.853 |
| 1329.0 | 91.856 |
| 1328.0 | 91.853 |
| 1327.0 | 91.864 |
| 1326.0 | 91.872 |
| 1325.0 | 91.854 |
| 1324.0 | 91.867 |
| 1323.0 | 91.867 |
| 1322.0 | 91.864 |
| 1321.0 | 91.874 |
| 1320.0 | 91.883 |
| 1319.0 | 91.877 |
| 1318.0 | 91.863 |
| 1317.0 | 91.853 |
| 1316.0 | 91.863 |
| 1315.0 | 91.863 |
| 1314.0 | 91.861 |
| 1313.0 | 91.846 |
| 1312.0 | 91.844 |
| 1311.0 | 91.849 |
| 1310.0 | 91.838 |
| 1309.0 | 91.841 |
| 1308.0 | 91.848 |
| 1307.0 | 91.857 |
| 1306.0 | 91.842 |
| 1305.0 | 91.851 |
| 1304.0 | 91.849 |
| 1303.0 | 91.848 |
| 1302.0 | 91.845 |
| 1301.0 | 91.849 |
| 1300.0 | 91.837 |
| 1299.0 | 91.827 |
| 1298.0 | 91.839 |
| 1297.0 | 91.829 |
| 1296.0 | 91.824 |
| 1295.0 | 91.831 |
| 1294.0 | 91.834 |
| 1293.0 | 91.834 |
| 1292.0 | 91.836 |
| 1291.0 | 91.834 |
| 1290.0 | 91.823 |
| 1289.0 | 91.818 |
| 1288.0 | 91.82 |
| 1287.0 | 91.819 |
| 1286.0 | 91.825 |
| 1285.0 | 91.823 |
| 1284.0 | 91.834 |
| 1283.0 | 91.84 |
| 1282.0 | 91.827 |
| 1281.0 | 91.825 |
| 1280.0 | 91.827 |
| 1279.0 | 91.826 |
| 1278.0 | 91.811 |
| 1277.0 | 91.813 |
| 1276.0 | 91.809 |
| 1275.0 | 91.802 |
| 1274.0 | 91.807 |
| 1273.0 | 91.792 |
| 1272.0 | 91.78 |
| 1271.0 | 91.788 |
| 1270.0 | 91.811 |
| 1269.0 | 91.823 |
| 1268.0 | 91.805 |
| 1267.0 | 91.797 |
| 1266.0 | 91.781 |
| 1265.0 | 91.798 |
| 1264.0 | 91.812 |
| 1263.0 | 91.797 |
| 1262.0 | 91.804 |
| 1261.0 | 91.8 |
| 1260.0 | 91.831 |
| 1259.0 | 91.831 |
| 1258.0 | 91.799 |
| 1257.0 | 91.792 |
| 1256.0 | 91.786 |
| 1255.0 | 91.8 |
| 1254.0 | 91.811 |
| 1253.0 | 91.813 |
| 1252.0 | 91.793 |
| 1251.0 | 91.783 |
| 1250.0 | 91.773 |
| 1249.0 | 91.755 |
| 1248.0 | 91.758 |
| 1247.0 | 91.771 |
| 1246.0 | 91.785 |
| 1245.0 | 91.797 |
| 1244.0 | 91.796 |
| 1243.0 | 91.8 |
| 1242.0 | 91.802 |
| 1241.0 | 91.788 |
| 1240.0 | 91.815 |
| 1239.0 | 91.816 |
| 1238.0 | 91.794 |
| 1237.0 | 91.79 |
| 1236.0 | 91.775 |
| 1235.0 | 91.771 |
| 1234.0 | 91.778 |
| 1233.0 | 91.773 |
| 1232.0 | 91.784 |
| 1231.0 | 91.788 |
| 1230.0 | 91.797 |
| 1229.0 | 91.79 |
| 1228.0 | 91.805 |
| 1227.0 | 91.783 |
| 1226.0 | 91.775 |
| 1225.0 | 91.775 |
| 1224.0 | 91.762 |
| 1223.0 | 91.765 |
| 1222.0 | 91.764 |
| 1221.0 | 91.765 |
| 1220.0 | 91.776 |
| 1219.0 | 91.754 |
| 1218.0 | 91.751 |
| 1217.0 | 91.737 |
| 1216.0 | 91.762 |
| 1215.0 | 91.767 |
| 1214.0 | 91.775 |
| 1213.0 | 91.767 |
| 1212.0 | 91.762 |
| 1211.0 | 91.767 |
| 1210.0 | 91.775 |
| 1209.0 | 91.773 |
| 1208.0 | 91.759 |
| 1207.0 | 91.772 |
| 1206.0 | 91.77 |
| 1205.0 | 91.762 |
| 1204.0 | 91.77 |
| 1203.0 | 91.76 |
| 1202.0 | 91.751 |
| 1201.0 | 91.748 |
| 1200.0 | 91.743 |
| 1199.0 | 91.744 |
| 1198.0 | 91.736 |
| 1197.0 | 91.732 |
| 1196.0 | 91.731 |
| 1195.0 | 91.721 |
| 1194.0 | 91.709 |
| 1193.0 | 91.708 |
| 1192.0 | 91.732 |
| 1191.0 | 91.737 |
| 1190.0 | 91.75 |
| 1189.0 | 91.745 |
| 1188.0 | 91.736 |
| 1187.0 | 91.713 |
| 1186.0 | 91.713 |
| 1185.0 | 91.728 |
| 1184.0 | 91.731 |
| 1183.0 | 91.707 |
| 1182.0 | 91.726 |
| 1181.0 | 91.731 |
| 1180.0 | 91.727 |
| 1179.0 | 91.717 |
| 1178.0 | 91.714 |
| 1177.0 | 91.706 |
| 1176.0 | 91.707 |
| 1175.0 | 91.693 |
| 1174.0 | 91.715 |
| 1173.0 | 91.71 |
| 1172.0 | 91.718 |
| 1171.0 | 91.725 |
| 1170.0 | 91.714 |
| 1169.0 | 91.727 |
| 1168.0 | 91.718 |
| 1167.0 | 91.712 |
| 1166.0 | 91.711 |
| 1165.0 | 91.708 |
| 1164.0 | 91.7 |
| 1163.0 | 91.699 |
| 1162.0 | 91.718 |
| 1161.0 | 91.709 |
| 1160.0 | 91.684 |
| 1159.0 | 91.689 |
| 1158.0 | 91.689 |
| 1157.0 | 91.698 |
| 1156.0 | 91.69 |
| 1155.0 | 91.685 |
| 1154.0 | 91.688 |
| 1153.0 | 91.672 |
| 1152.0 | 91.686 |
| 1151.0 | 91.691 |
| 1150.0 | 91.683 |
| 1149.0 | 91.679 |
| 1148.0 | 91.687 |
| 1147.0 | 91.694 |
| 1146.0 | 91.715 |
| 1145.0 | 91.676 |
| 1144.0 | 91.658 |
| 1143.0 | 91.667 |
| 1142.0 | 91.683 |
| 1141.0 | 91.69 |
| 1140.0 | 91.685 |
| 1139.0 | 91.667 |
| 1138.0 | 91.665 |
| 1137.0 | 91.682 |
| 1136.0 | 91.689 |
| 1135.0 | 91.667 |
| 1134.0 | 91.673 |
| 1133.0 | 91.66 |
| 1132.0 | 91.669 |
| 1131.0 | 91.729 |
| 1130.0 | 91.692 |
| 1129.0 | 91.677 |
| 1128.0 | 91.664 |
| 1127.0 | 91.675 |
| 1126.0 | 91.642 |
| 1125.0 | 91.652 |
| 1124.0 | 91.67 |
| 1123.0 | 91.668 |
| 1122.0 | 91.642 |
| 1121.0 | 91.659 |
| 1120.0 | 91.651 |
| 1119.0 | 91.656 |
| 1118.0 | 91.677 |
| 1117.0 | 91.672 |
| 1116.0 | 91.659 |
| 1115.0 | 91.66 |
| 1114.0 | 91.662 |
| 1113.0 | 91.671 |
| 1112.0 | 91.659 |
| 1111.0 | 91.658 |
| 1110.0 | 91.663 |
| 1109.0 | 91.655 |
| 1108.0 | 91.659 |
| 1107.0 | 91.663 |
| 1106.0 | 91.668 |
| 1105.0 | 91.659 |
| 1104.0 | 91.655 |
| 1103.0 | 91.653 |
| 1102.0 | 91.651 |
| 1101.0 | 91.646 |
| 1100.0 | 91.683 |
| 1099.0 | 91.657 |
| 1098.0 | 91.645 |
| 1097.0 | 91.663 |
| 1096.0 | 91.649 |
| 1095.0 | 91.657 |
| 1094.0 | 91.67 |
| 1093.0 | 91.675 |
| 1092.0 | 91.645 |
| 1091.0 | 91.651 |
| 1090.0 | 91.616 |
| 1089.0 | 91.681 |
| 1088.0 | 91.669 |
| 1087.0 | 91.677 |
| 1086.0 | 91.675 |
| 1085.0 | 91.664 |
| 1084.0 | 91.651 |
| 1083.0 | 91.653 |
| 1082.0 | 91.657 |
| 1081.0 | 91.64 |
| 1080.0 | 91.63 |
| 1079.0 | 91.627 |
| 1078.0 | 91.631 |
| 1077.0 | 91.622 |
| 1076.0 | 91.618 |
| 1075.0 | 91.636 |
| 1074.0 | 91.649 |
| 1073.0 | 91.657 |
| 1072.0 | 91.633 |
| 1071.0 | 91.674 |
| 1070.0 | 91.651 |
| 1069.0 | 91.669 |
| 1068.0 | 91.655 |
| 1067.0 | 91.649 |
| 1066.0 | 91.619 |
| 1065.0 | 91.629 |
| 1064.0 | 91.639 |
| 1063.0 | 91.651 |
| 1062.0 | 91.613 |
| 1061.0 | 91.627 |
| 1060.0 | 91.642 |
| 1059.0 | 91.651 |
| 1058.0 | 91.644 |
| 1057.0 | 91.646 |
| 1056.0 | 91.652 |
| 1055.0 | 91.652 |
| 1054.0 | 91.652 |
| 1053.0 | 91.653 |
| 1052.0 | 91.664 |
| 1051.0 | 91.646 |
| 1050.0 | 91.628 |
| 1049.0 | 91.629 |
| 1048.0 | 91.654 |
| 1047.0 | 91.65 |
| 1046.0 | 91.637 |
| 1045.0 | 91.607 |
| 1044.0 | 91.618 |
| 1043.0 | 91.606 |
| 1042.0 | 91.613 |
| 1041.0 | 91.623 |
| 1040.0 | 91.635 |
| 1039.0 | 91.645 |
| 1038.0 | 91.655 |
| 1037.0 | 91.669 |
| 1036.0 | 91.64 |
| 1035.0 | 91.632 |
| 1034.0 | 91.629 |
| 1033.0 | 91.626 |
| 1032.0 | 91.593 |
| 1031.0 | 91.622 |
| 1030.0 | 91.649 |
| 1029.0 | 91.638 |
| 1028.0 | 91.629 |
| 1027.0 | 91.652 |
| 1026.0 | 91.617 |
| 1025.0 | 91.651 |
| 1024.0 | 91.656 |
| 1023.0 | 91.646 |
| 1022.0 | 91.636 |
| 1021.0 | 91.641 |
| 1020.0 | 91.636 |
| 1019.0 | 91.631 |
| 1018.0 | 91.636 |
| 1017.0 | 91.634 |
| 1016.0 | 91.652 |
| 1015.0 | 91.632 |
| 1014.0 | 91.635 |
| 1013.0 | 91.642 |
| 1012.0 | 91.639 |
| 1011.0 | 91.635 |
| 1010.0 | 91.636 |
| 1009.0 | 91.65 |
| 1008.0 | 91.66 |
| 1007.0 | 91.688 |
| 1006.0 | 91.649 |
| 1005.0 | 91.644 |
| 1004.0 | 91.649 |
| 1003.0 | 91.642 |
| 1002.0 | 91.629 |
| 1001.0 | 91.629 |
| 1000.0 | 91.635 |
| 999.0 | 91.633 |
| 998.0 | 91.626 |
| 997.0 | 91.664 |
| 996.0 | 91.631 |
| 995.0 | 91.63 |
| 994.0 | 91.608 |
| 993.0 | 91.665 |
| 992.0 | 91.631 |
| 991.0 | 91.612 |
| 990.0 | 91.642 |
| 989.0 | 91.634 |
| 988.0 | 91.644 |
| 987.0 | 91.613 |
| 986.0 | 91.608 |
| 985.0 | 91.655 |
| 984.0 | 91.661 |
| 983.0 | 91.629 |
| 982.0 | 91.609 |
| 981.0 | 91.628 |
| 980.0 | 91.619 |
| 979.0 | 91.629 |
| 978.0 | 91.622 |
| 977.0 | 91.646 |
| 976.0 | 91.645 |
| 975.0 | 91.64 |
| 974.0 | 91.626 |
| 973.0 | 91.658 |
| 972.0 | 91.671 |
| 971.0 | 91.66 |
| 970.0 | 91.659 |
| 969.0 | 91.65 |
| 968.0 | 91.636 |
| 967.0 | 91.654 |
| 966.0 | 91.663 |
| 965.0 | 91.641 |
| 964.0 | 91.638 |
| 963.0 | 91.645 |
| 962.0 | 91.647 |
| 961.0 | 91.63 |
| 960.0 | 91.63 |
| 959.0 | 91.642 |
| 958.0 | 91.637 |
| 957.0 | 91.636 |
| 956.0 | 91.623 |
| 955.0 | 91.622 |
| 954.0 | 91.633 |
| 953.0 | 91.631 |
| 952.0 | 91.662 |
| 951.0 | 91.662 |
| 950.0 | 91.67 |
| 949.0 | 91.661 |
| 948.0 | 91.665 |
| 947.0 | 91.662 |
| 946.0 | 91.663 |
| 945.0 | 91.653 |
| 944.0 | 91.649 |
| 943.0 | 91.653 |
| 942.0 | 91.641 |
| 941.0 | 91.648 |
| 940.0 | 91.646 |
| 939.0 | 91.683 |
| 938.0 | 91.664 |
| 937.0 | 91.641 |
| 936.0 | 91.652 |
| 935.0 | 91.683 |
| 934.0 | 91.709 |
| 933.0 | 91.677 |
| 932.0 | 91.645 |
| 931.0 | 91.677 |
| 930.0 | 91.687 |
| 929.0 | 91.67 |
| 928.0 | 91.693 |
| 927.0 | 91.669 |
| 926.0 | 91.656 |
| 925.0 | 91.644 |
| 924.0 | 91.645 |
| 923.0 | 91.687 |
| 922.0 | 91.691 |
| 921.0 | 91.668 |
| 920.0 | 91.655 |
| 919.0 | 91.623 |
| 918.0 | 91.637 |
| 917.0 | 91.677 |
| 916.0 | 91.668 |
| 915.0 | 91.671 |
| 914.0 | 91.662 |
| 913.0 | 91.66 |
| 912.0 | 91.653 |
| 911.0 | 91.661 |
| 910.0 | 91.679 |
| 909.0 | 91.65 |
| 908.0 | 91.652 |
| 907.0 | 91.67 |
| 906.0 | 91.671 |
| 905.0 | 91.657 |
| 904.0 | 91.658 |
| 903.0 | 91.654 |
| 902.0 | 91.651 |
| 901.0 | 91.65 |
| 900.0 | 91.641 |
| 899.0 | 91.646 |
| 898.0 | 91.65 |
| 897.0 | 91.666 |
| 896.0 | 91.665 |
| 895.0 | 91.636 |
| 894.0 | 91.626 |
| 893.0 | 91.619 |
| 892.0 | 91.637 |
| 891.0 | 91.671 |
| 890.0 | 91.685 |
| 889.0 | 91.666 |
| 888.0 | 91.639 |
| 887.0 | 91.645 |
| 886.0 | 91.66 |
| 885.0 | 91.661 |
| 884.0 | 91.646 |
| 883.0 | 91.632 |
| 882.0 | 91.64 |
| 881.0 | 91.654 |
| 880.0 | 91.663 |
| 879.0 | 91.673 |
| 878.0 | 91.658 |
| 877.0 | 91.634 |
| 876.0 | 91.643 |
| 875.0 | 91.662 |
| 874.0 | 91.663 |
| 873.0 | 91.665 |
| 872.0 | 91.657 |
| 871.0 | 91.651 |
| 870.0 | 91.654 |
| 869.0 | 91.661 |
| 868.0 | 91.648 |
| 867.0 | 91.638 |
| 866.0 | 91.638 |
| 865.0 | 91.636 |
| 864.0 | 91.644 |
| 863.0 | 91.629 |
| 862.0 | 91.631 |
| 861.0 | 91.647 |
| 860.0 | 90.889 |
| 859.0 | 90.319 |
| 858.0 | 90.347 |
| 857.0 | 90.359 |
| 856.0 | 90.314 |
| 855.0 | 90.323 |
| 854.0 | 90.368 |
| 853.0 | 90.412 |
| 852.0 | 90.426 |
| 851.0 | 90.414 |
| 850.0 | 90.419 |
| 849.0 | 90.477 |
| 848.0 | 90.493 |
| 847.0 | 90.42 |
| 846.0 | 90.443 |
| 845.0 | 90.485 |
| 844.0 | 90.499 |
| 843.0 | 90.472 |
| 842.0 | 90.494 |
| 841.0 | 90.472 |
| 840.0 | 90.498 |
| 839.0 | 90.515 |
| 838.0 | 90.495 |
| 837.0 | 90.481 |
| 836.0 | 90.502 |
| 835.0 | 90.507 |
| 834.0 | 90.51 |
| 833.0 | 90.543 |
| 832.0 | 90.53 |
| 831.0 | 90.516 |
| 830.0 | 90.534 |
| 829.0 | 90.487 |
| 828.0 | 90.509 |
| 827.0 | 90.528 |
| 826.0 | 90.507 |
| 825.0 | 90.526 |
| 824.0 | 90.522 |
| 823.0 | 90.515 |
| 822.0 | 90.558 |
| 821.0 | 90.546 |
| 820.0 | 90.504 |
| 819.0 | 90.503 |
| 818.0 | 90.516 |
| 817.0 | 90.501 |
| 816.0 | 90.516 |
| 815.0 | 90.551 |
| 814.0 | 90.514 |
| 813.0 | 90.523 |
| 812.0 | 90.524 |
| 811.0 | 90.507 |
| 810.0 | 90.527 |
| 809.0 | 90.529 |
| 808.0 | 90.49 |
| 807.0 | 90.524 |
| 806.0 | 90.542 |
| 805.0 | 90.515 |
| 804.0 | 90.512 |
| 803.0 | 90.529 |
| 802.0 | 90.51 |
| 801.0 | 90.534 |
| 800.0 | 90.539 |
| 799.0 | 90.523 |
| 798.0 | 90.545 |
| 797.0 | 90.535 |
| 796.0 | 90.528 |
| 795.0 | 90.54 |
| 794.0 | 90.544 |
| 793.0 | 90.499 |
| 792.0 | 90.509 |
| 791.0 | 90.54 |
| 790.0 | 90.503 |
| 789.0 | 90.536 |
| 788.0 | 90.562 |
| 787.0 | 90.568 |
| 786.0 | 90.556 |
| 785.0 | 90.554 |
| 784.0 | 90.528 |
| 783.0 | 90.551 |
| 782.0 | 90.56 |
| 781.0 | 90.525 |
| 780.0 | 90.531 |
| 779.0 | 90.547 |
| 778.0 | 90.533 |
| 777.0 | 90.57 |
| 776.0 | 90.609 |
| 775.0 | 90.551 |
| 774.0 | 90.561 |
| 773.0 | 90.554 |
| 772.0 | 90.535 |
| 771.0 | 90.577 |
| 770.0 | 90.587 |
| 769.0 | 90.538 |
| 768.0 | 90.536 |
| 767.0 | 90.563 |
| 766.0 | 90.511 |
| 765.0 | 90.575 |
| 764.0 | 90.589 |
| 763.0 | 90.538 |
| 762.0 | 90.564 |
| 761.0 | 90.57 |
| 760.0 | 90.545 |
| 759.0 | 90.588 |
| 758.0 | 90.575 |
| 757.0 | 90.531 |
| 756.0 | 90.557 |
| 755.0 | 90.585 |
| 754.0 | 90.531 |
| 753.0 | 90.582 |
| 752.0 | 90.579 |
| 751.0 | 90.543 |
| 750.0 | 90.564 |
| 749.0 | 90.582 |
| 748.0 | 90.535 |
| 747.0 | 90.589 |
| 746.0 | 90.599 |
| 745.0 | 90.553 |
| 744.0 | 90.558 |
| 743.0 | 90.59 |
| 742.0 | 90.534 |
| 741.0 | 90.586 |
| 740.0 | 90.59 |
| 739.0 | 90.542 |
| 738.0 | 90.55 |
| 737.0 | 90.557 |
| 736.0 | 90.506 |
| 735.0 | 90.549 |
| 734.0 | 90.556 |
| 733.0 | 90.541 |
| 732.0 | 90.551 |
| 731.0 | 90.542 |
| 730.0 | 90.515 |
| 729.0 | 90.575 |
| 728.0 | 90.578 |
| 727.0 | 90.533 |
| 726.0 | 90.544 |
| 725.0 | 90.531 |
| 724.0 | 90.513 |
| 723.0 | 90.564 |
| 722.0 | 90.564 |
| 721.0 | 90.508 |
| 720.0 | 90.539 |
| 719.0 | 90.549 |
| 718.0 | 90.492 |
| 717.0 | 90.565 |
| 716.0 | 90.582 |
| 715.0 | 90.524 |
| 714.0 | 90.525 |
| 713.0 | 90.527 |
| 712.0 | 90.487 |
| 711.0 | 90.553 |
| 710.0 | 90.545 |
| 709.0 | 90.505 |
| 708.0 | 90.547 |
| 707.0 | 90.534 |
| 706.0 | 90.471 |
| 705.0 | 90.561 |
| 704.0 | 90.523 |
| 703.0 | 90.464 |
| 702.0 | 90.512 |
| 701.0 | 90.525 |
| 700.0 | 90.469 |
| 699.0 | 90.531 |
| 698.0 | 90.529 |
| 697.0 | 90.474 |
| 696.0 | 90.491 |
| 695.0 | 90.504 |
| 694.0 | 90.447 |
| 693.0 | 90.513 |
| 692.0 | 90.516 |
| 691.0 | 90.482 |
| 690.0 | 90.497 |
| 689.0 | 90.491 |
| 688.0 | 90.419 |
| 687.0 | 90.467 |
| 686.0 | 90.493 |
| 685.0 | 90.42 |
| 684.0 | 90.465 |
| 683.0 | 90.458 |
| 682.0 | 90.404 |
| 681.0 | 90.444 |
| 680.0 | 90.487 |
| 679.0 | 90.414 |
| 678.0 | 90.467 |
| 677.0 | 90.438 |
| 676.0 | 90.382 |
| 675.0 | 90.449 |
| 674.0 | 90.427 |
| 673.0 | 90.375 |
| 672.0 | 90.407 |
| 671.0 | 90.399 |
| 670.0 | 90.329 |
| 669.0 | 90.403 |
| 668.0 | 90.404 |
| 667.0 | 90.349 |
| 666.0 | 90.38 |
| 665.0 | 90.376 |
| 664.0 | 90.322 |
| 663.0 | 90.377 |
| 662.0 | 90.367 |
| 661.0 | 90.306 |
| 660.0 | 90.346 |
| 659.0 | 90.309 |
| 658.0 | 90.278 |
| 657.0 | 90.322 |
| 656.0 | 90.34 |
| 655.0 | 90.271 |
| 654.0 | 90.326 |
| 653.0 | 90.31 |
| 652.0 | 90.272 |
| 651.0 | 90.31 |
| 650.0 | 90.327 |
| 649.0 | 90.252 |
| 648.0 | 90.316 |
| 647.0 | 90.311 |
| 646.0 | 90.268 |
| 645.0 | 90.304 |
| 644.0 | 90.315 |
| 643.0 | 90.303 |
| 642.0 | 90.323 |
| 641.0 | 90.293 |
| 640.0 | 90.255 |
| 639.0 | 90.311 |
| 638.0 | 90.323 |
| 637.0 | 90.261 |
| 636.0 | 90.298 |
| 635.0 | 90.306 |
| 634.0 | 90.257 |
| 633.0 | 90.315 |
| 632.0 | 90.335 |
| 631.0 | 90.292 |
| 630.0 | 90.314 |
| 629.0 | 90.303 |
| 628.0 | 90.265 |
| 627.0 | 90.319 |
| 626.0 | 90.35 |
| 625.0 | 90.308 |
| 624.0 | 90.311 |
| 623.0 | 90.311 |
| 622.0 | 90.284 |
| 621.0 | 90.353 |
| 620.0 | 90.355 |
| 619.0 | 90.302 |
| 618.0 | 90.335 |
| 617.0 | 90.322 |
| 616.0 | 90.306 |
| 615.0 | 90.364 |
| 614.0 | 90.36 |
| 613.0 | 90.314 |
| 612.0 | 90.344 |
| 611.0 | 90.335 |
| 610.0 | 90.317 |
| 609.0 | 90.379 |
| 608.0 | 90.374 |
| 607.0 | 90.325 |
| 606.0 | 90.362 |
| 605.0 | 90.342 |
| 604.0 | 90.326 |
| 603.0 | 90.391 |
| 602.0 | 90.383 |
| 601.0 | 90.338 |
| 600.0 | 90.37 |
| 599.0 | 90.332 |
| 598.0 | 90.332 |
| 597.0 | 90.375 |
| 596.0 | 90.372 |
| 595.0 | 90.344 |
| 594.0 | 90.38 |
| 593.0 | 90.354 |
| 592.0 | 90.329 |
| 591.0 | 90.399 |
| 590.0 | 90.395 |
| 589.0 | 90.344 |
| 588.0 | 90.381 |
| 587.0 | 90.368 |
| 586.0 | 90.335 |
| 585.0 | 90.382 |
| 584.0 | 90.406 |
| 583.0 | 90.37 |
| 582.0 | 90.383 |
| 581.0 | 90.371 |
| 580.0 | 90.356 |
| 579.0 | 90.405 |
| 578.0 | 90.396 |
| 577.0 | 90.368 |
| 576.0 | 90.388 |
| 575.0 | 90.376 |
| 574.0 | 90.358 |
| 573.0 | 90.406 |
| 572.0 | 90.385 |
| 571.0 | 90.355 |
| 570.0 | 90.371 |
| 569.0 | 90.373 |
| 568.0 | 90.355 |
| 567.0 | 90.41 |
| 566.0 | 90.383 |
| 565.0 | 90.347 |
| 564.0 | 90.371 |
| 563.0 | 90.357 |
| 562.0 | 90.345 |
| 561.0 | 90.367 |
| 560.0 | 90.34 |
| 559.0 | 90.372 |
| 558.0 | 90.368 |
| 557.0 | 90.339 |
| 556.0 | 90.376 |
| 555.0 | 90.356 |
| 554.0 | 90.335 |
| 553.0 | 90.382 |
| 552.0 | 90.355 |
| 551.0 | 90.339 |
| 550.0 | 90.366 |
| 549.0 | 90.331 |
| 548.0 | 90.314 |
| 547.0 | 90.338 |
| 546.0 | 90.319 |
| 545.0 | 90.295 |
| 544.0 | 90.303 |
| 543.0 | 90.293 |
| 542.0 | 90.31 |
| 541.0 | 90.346 |
| 540.0 | 90.324 |
| 539.0 | 90.284 |
| 538.0 | 90.294 |
| 537.0 | 90.314 |
| 536.0 | 90.293 |
| 535.0 | 90.324 |
| 534.0 | 90.303 |
| 533.0 | 90.276 |
| 532.0 | 90.296 |
| 531.0 | 90.272 |
| 530.0 | 90.264 |
| 529.0 | 90.295 |
| 528.0 | 90.273 |
| 527.0 | 90.255 |
| 526.0 | 90.279 |
| 525.0 | 90.245 |
| 524.0 | 90.233 |
| 523.0 | 90.276 |
| 522.0 | 90.26 |
| 521.0 | 90.241 |
| 520.0 | 90.261 |
| 519.0 | 90.227 |
| 518.0 | 90.216 |
| 517.0 | 90.245 |
| 516.0 | 90.218 |
| 515.0 | 90.197 |
| 514.0 | 90.23 |
| 513.0 | 90.212 |
| 512.0 | 90.189 |
| 511.0 | 90.211 |
| 510.0 | 90.189 |
| 509.0 | 90.165 |
| 508.0 | 90.172 |
| 507.0 | 90.143 |
| 506.0 | 90.133 |
| 505.0 | 90.163 |
| 504.0 | 90.136 |
| 503.0 | 90.104 |
| 502.0 | 90.116 |
| 501.0 | 90.093 |
| 500.0 | 90.098 |
| 499.0 | 90.141 |
| 498.0 | 90.103 |
| 497.0 | 90.065 |
| 496.0 | 90.069 |
| 495.0 | 90.045 |
| 494.0 | 90.04 |
| 493.0 | 90.058 |
| 492.0 | 90.027 |
| 491.0 | 90.021 |
| 490.0 | 90.036 |
| 489.0 | 89.991 |
| 488.0 | 89.988 |
| 487.0 | 90.021 |
| 486.0 | 89.981 |
| 485.0 | 89.967 |
| 484.0 | 89.988 |
| 483.0 | 89.95 |
| 482.0 | 89.962 |
| 481.0 | 89.987 |
| 480.0 | 89.939 |
| 479.0 | 89.916 |
| 478.0 | 89.924 |
| 477.0 | 89.889 |
| 476.0 | 89.896 |
| 475.0 | 89.925 |
| 474.0 | 89.878 |
| 473.0 | 89.855 |
| 472.0 | 89.872 |
| 471.0 | 89.846 |
| 470.0 | 89.861 |
| 469.0 | 89.883 |
| 468.0 | 89.831 |
| 467.0 | 89.821 |
| 466.0 | 89.835 |
| 465.0 | 89.785 |
| 464.0 | 89.788 |
| 463.0 | 89.808 |
| 462.0 | 89.752 |
| 461.0 | 89.734 |
| 460.0 | 89.744 |
| 459.0 | 89.706 |
| 458.0 | 89.717 |
| 457.0 | 89.734 |
| 456.0 | 89.669 |
| 455.0 | 89.646 |
| 454.0 | 89.644 |
| 453.0 | 89.597 |
| 452.0 | 89.607 |
| 451.0 | 89.628 |
| 450.0 | 89.567 |
| 449.0 | 89.545 |
| 448.0 | 89.536 |
| 447.0 | 89.488 |
| 446.0 | 89.506 |
| 445.0 | 89.524 |
| 444.0 | 89.464 |
| 443.0 | 89.454 |
| 442.0 | 89.473 |
| 441.0 | 89.429 |
| 440.0 | 89.454 |
| 439.0 | 89.487 |
| 438.0 | 89.443 |
| 437.0 | 89.429 |
| 436.0 | 89.446 |
| 435.0 | 89.401 |
| 434.0 | 89.435 |
| 433.0 | 89.476 |
| 432.0 | 89.434 |
| 431.0 | 89.44 |
| 430.0 | 89.467 |
| 429.0 | 89.427 |
| 428.0 | 89.451 |
| 427.0 | 89.495 |
| 426.0 | 89.446 |
| 425.0 | 89.423 |
| 424.0 | 89.438 |
| 423.0 | 89.404 |
| 422.0 | 89.408 |
| 421.0 | 89.442 |
| 420.0 | 89.425 |
| 419.0 | 89.415 |
| 418.0 | 89.42 |
| 417.0 | 89.387 |
| 416.0 | 89.408 |
| 415.0 | 89.434 |
| 414.0 | 89.398 |
| 413.0 | 89.416 |
| 412.0 | 89.435 |
| 411.0 | 89.399 |
| 410.0 | 89.429 |
| 409.0 | 89.457 |
| 408.0 | 89.419 |
| 407.0 | 89.43 |
| 406.0 | 89.436 |
| 405.0 | 89.393 |
| 404.0 | 89.424 |
| 403.0 | 89.444 |
| 402.0 | 89.391 |
| 401.0 | 89.381 |
| 400.0 | 89.364 |
| 399.0 | 89.285 |
| 398.0 | 89.289 |
| 397.0 | 89.287 |
| 396.0 | 89.187 |
| 395.0 | 89.136 |
| 394.0 | 89.079 |
| 393.0 | 88.984 |
| 392.0 | 88.931 |
| 391.0 | 88.846 |
| 390.0 | 88.701 |
| 389.0 | 88.607 |
| 388.0 | 88.47 |
| 387.0 | 88.273 |
| 386.0 | 88.165 |
| 385.0 | 88.028 |
| 384.0 | 87.804 |
| 383.0 | 87.654 |
| 382.0 | 87.514 |
| 381.0 | 87.322 |
| 380.0 | 87.238 |
| 379.0 | 87.174 |
| 378.0 | 87.097 |
| 377.0 | 87.07 |
| 376.0 | 87.096 |
| 375.0 | 87.137 |
| 374.0 | 87.12 |
| 373.0 | 87.131 |
| 372.0 | 87.083 |
| 371.0 | 87.009 |
| 370.0 | 86.945 |
| 369.0 | 86.835 |
| 368.0 | 86.663 |
| 367.0 | 86.486 |
| 366.0 | 86.291 |
| 365.0 | 86.008 |
| 364.0 | 85.791 |
| 363.0 | 85.56 |
| 362.0 | 85.222 |
| 361.0 | 84.929 |
| 360.0 | 84.583 |
| 359.0 | 84.129 |
| 358.0 | 83.746 |
| 357.0 | 83.31 |
| 356.0 | 82.769 |
| 355.0 | 82.248 |
| 354.0 | 81.69 |
| 353.0 | 81.054 |
| 352.0 | 80.428 |
| 351.0 | 79.744 |
| 350.0 | 78.934 |
| 349.0 | 78.11 |
| 348.0 | 77.235 |
| 347.0 | 76.235 |
| 346.0 | 75.23 |
| 345.0 | 74.138 |
| 344.0 | 72.931 |
| 343.0 | 71.721 |
| 342.0 | 70.395 |
| 341.0 | 68.944 |
| 340.0 | 67.435 |
| 339.0 | 65.807 |
| 338.0 | 64.018 |
| 337.0 | 62.192 |
| 336.0 | 60.231 |
| 335.0 | 58.168 |
| 334.0 | 56.052 |
| 333.0 | 53.911 |
| 332.0 | 51.589 |
| 331.0 | 49.21 |
| 330.0 | 46.693 |
| 329.0 | 44.04 |
| 328.0 | 41.389 |
| 327.0 | 38.631 |
| 326.0 | 35.836 |
| 325.0 | 33.12 |
| 324.0 | 30.372 |
| 323.0 | 27.677 |
| 322.0 | 25.048 |
| 321.0 | 22.412 |
| 320.0 | 19.827 |
| 319.0 | 17.354 |
| 318.0 | 15.146 |
| 317.0 | 12.974 |
| 316.0 | 10.991 |
| 315.0 | 9.208 |
| 314.0 | 7.61 |
| 313.0 | 6.242 |
| 312.0 | 5.045 |
| 311.0 | 4.022 |
| 310.0 | 3.183 |
| 309.0 | 2.508 |
| 308.0 | 1.977 |
| 307.0 | 1.584 |
| 306.0 | 1.295 |
| 305.0 | 1.091 |
| 304.0 | 0.952 |
| 303.0 | 0.868 |
| 302.0 | 0.808 |
| 301.0 | 0.776 |
| 300.0 | 0.759 |
| 299.0 | 0.747 |
| 298.0 | 0.737 |
| 297.0 | 0.74 |
| 296.0 | 0.734 |
| 295.0 | 0.735 |
| 294.0 | 0.734 |
| 293.0 | 0.729 |
| 292.0 | 0.729 |
| 291.0 | 0.738 |
| 290.0 | 0.738 |
| 289.0 | 0.737 |
| 288.0 | 0.733 |
| 287.0 | 0.73 |
| 286.0 | 0.73 |
| 285.0 | 0.732 |
| 284.0 | 0.729 |
| 283.0 | 0.732 |
| 282.0 | 0.731 |
| 281.0 | 0.727 |
| 280.0 | 0.724 |
| 279.0 | 0.727 |
| 278.0 | 0.728 |
| 277.0 | 0.729 |
| 276.0 | 0.728 |
| 275.0 | 0.726 |
| 274.0 | 0.719 |
| 273.0 | 0.725 |
| 272.0 | 0.722 |
| 271.0 | 0.726 |
| 270.0 | 0.725 |
| 269.0 | 0.723 |
| 268.0 | 0.724 |
| 267.0 | 0.729 |
| 266.0 | 0.724 |
| 265.0 | 0.729 |
| 264.0 | 0.727 |
| 263.0 | 0.728 |
| 262.0 | 0.725 |
| 261.0 | 0.728 |
| 260.0 | 0.726 |
| 259.0 | 0.73 |
| 258.0 | 0.728 |
| 257.0 | 0.725 |
| 256.0 | 0.723 |
| 255.0 | 0.728 |
| 254.0 | 0.724 |
| 253.0 | 0.728 |
| 252.0 | 0.727 |
| 251.0 | 0.726 |
| 250.0 | 0.724 |
| 249.0 | 0.724 |
| 248.0 | 0.724 |
| 247.0 | 0.726 |
| 246.0 | 0.724 |
| 245.0 | 0.72 |
| 244.0 | 0.719 |
| 243.0 | 0.728 |
| 242.0 | 0.725 |
| 241.0 | 0.725 |
| 240.0 | 0.724 |
| 239.0 | 0.723 |
| 238.0 | 0.722 |
| 237.0 | 0.726 |
| 236.0 | 0.727 |
| 235.0 | 0.73 |
| 234.0 | 0.729 |
| 233.0 | 0.729 |
| 232.0 | 0.729 |
| 231.0 | 0.73 |
| 230.0 | 0.733 |
| 229.0 | 0.735 |
| 228.0 | 0.734 |
| 227.0 | 0.733 |
| 226.0 | 0.731 |
| 225.0 | 0.735 |
| 224.0 | 0.735 |
| 223.0 | 0.739 |
| 222.0 | 0.738 |
| 221.0 | 0.737 |
| 220.0 | 0.738 |
| 219.0 | 0.744 |
| 218.0 | 0.745 |
| 217.0 | 0.749 |
| 216.0 | 0.748 |
| 215.0 | 0.748 |
| 214.0 | 0.751 |
| 213.0 | 0.757 |
| 212.0 | 0.757 |
| 211.0 | 0.759 |
| 210.0 | 0.759 |
| 209.0 | 0.762 |
| 208.0 | 0.763 |
| 207.0 | 0.77 |
| 206.0 | 0.772 |
| 205.0 | 0.777 |
| 204.0 | 0.778 |
| 203.0 | 0.78 |
| 202.0 | 0.785 |
| 201.0 | 0.792 |
| 200.0 | 0.79 |